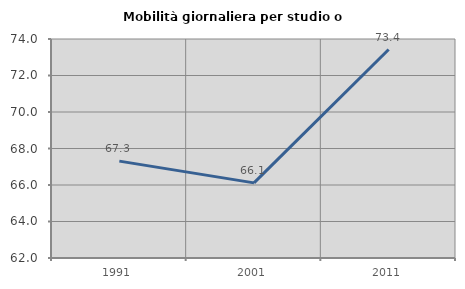
| Category | Mobilità giornaliera per studio o lavoro |
|---|---|
| 1991.0 | 67.308 |
| 2001.0 | 66.116 |
| 2011.0 | 73.422 |